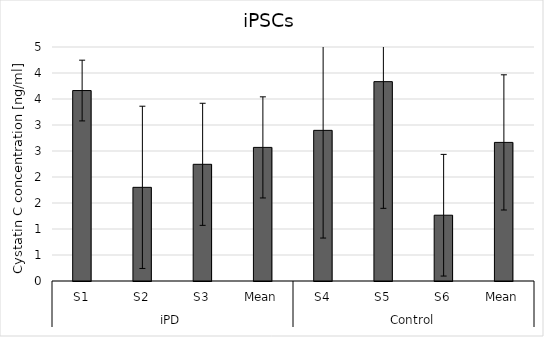
| Category | Series 0 |
|---|---|
| 0 | 3.663 |
| 1 | 1.801 |
| 2 | 2.244 |
| 3 | 2.569 |
| 4 | 2.897 |
| 5 | 3.834 |
| 6 | 1.265 |
| 7 | 2.665 |